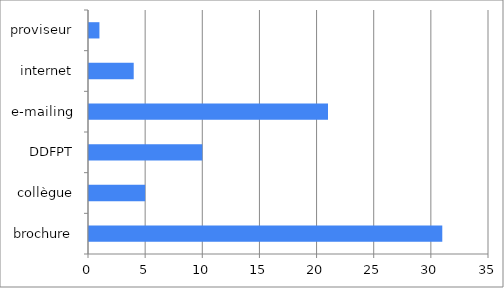
| Category | Series 0 |
|---|---|
| brochure | 31 |
| collègue | 5 |
| DDFPT | 10 |
| e-mailing | 21 |
| internet | 4 |
| proviseur | 1 |